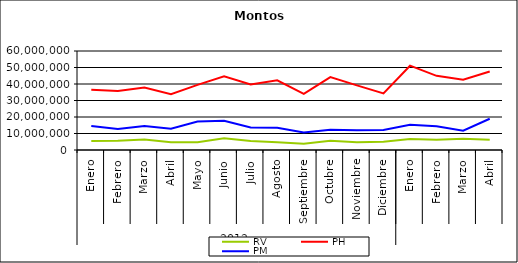
| Category | RV | PH | PM |
|---|---|---|---|
| 0 | 5488714.126 | 36545855.086 | 14497589.738 |
| 1 | 5561280.58 | 35823440.08 | 12698333.328 |
| 2 | 6398986.979 | 37854831.303 | 14475738.644 |
| 3 | 4681922.842 | 33750742.386 | 12858975.967 |
| 4 | 4682928.209 | 39491753.151 | 17313339.446 |
| 5 | 7096266.187 | 44637287.582 | 17754192.968 |
| 6 | 5451623.882 | 39757983.873 | 13624526.171 |
| 7 | 4684453.851 | 42224570.378 | 13520398.629 |
| 8 | 3854535.018 | 34047933.18 | 10553221.238 |
| 9 | 5602263.508 | 44148107.248 | 12207679.138 |
| 10 | 4675526.921 | 39150631.457 | 11989364.221 |
| 11 | 5068639.314 | 34283372.071 | 12134709.335 |
| 12 | 6603412.357 | 51097257.501 | 15291994.497 |
| 13 | 6144371.716 | 44938482.89 | 14418861.164 |
| 14 | 6870539.137 | 42574717.992 | 11735480.075 |
| 15 | 6139858.354 | 47535968.024 | 18924825.739 |